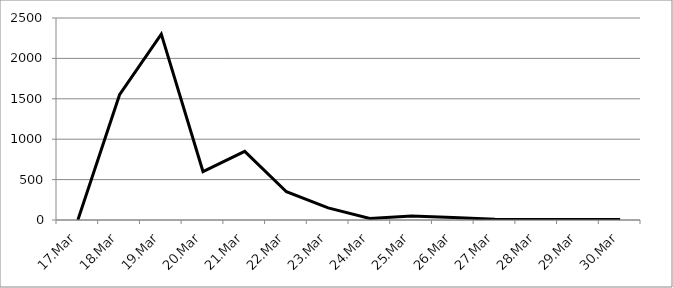
| Category | Series 0 |
|---|---|
| 17.Mar | 0 |
| 18.Mar | 1550 |
| 19.Mar | 2300 |
| 20.Mar | 600 |
| 21.Mar | 850 |
| 22.Mar | 350 |
| 23.Mar | 150 |
| 24.Mar | 20 |
| 25.Mar | 50 |
| 26.Mar | 30 |
| 27.Mar | 10 |
| 28.Mar | 5 |
| 29.Mar | 5 |
| 30.Mar | 5 |